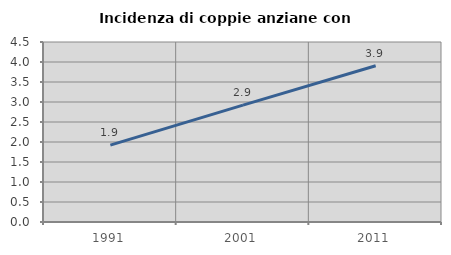
| Category | Incidenza di coppie anziane con figli |
|---|---|
| 1991.0 | 1.92 |
| 2001.0 | 2.923 |
| 2011.0 | 3.907 |